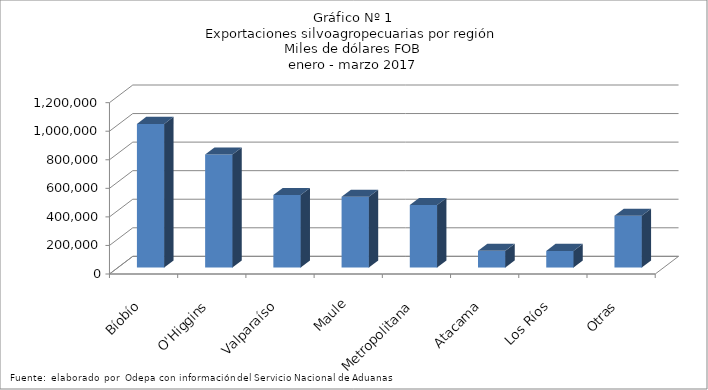
| Category | Series 0 |
|---|---|
| Bíobío | 1005805.76 |
| O'Higgins | 791916.233 |
| Valparaíso | 507556 |
| Maule | 495605.416 |
| Metropolitana | 438269.31 |
| Atacama | 116702.957 |
| Los Ríos | 116250.489 |
| Otras | 362461.926 |